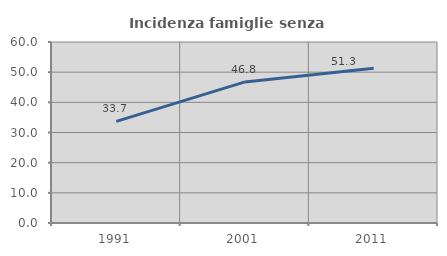
| Category | Incidenza famiglie senza nuclei |
|---|---|
| 1991.0 | 33.708 |
| 2001.0 | 46.779 |
| 2011.0 | 51.269 |